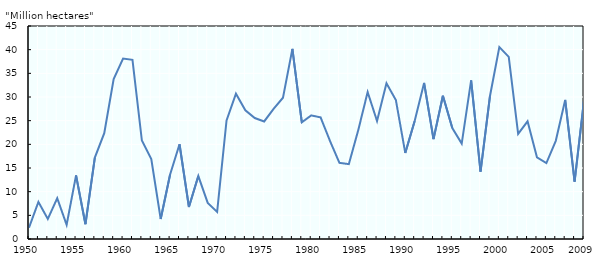
| Category | Million hectares |
|---|---|
| 1950.0 | 2.398 |
| nan | 7.829 |
| nan | 4.236 |
| nan | 8.616 |
| nan | 2.988 |
| 1955.0 | 13.433 |
| nan | 3.127 |
| nan | 17.205 |
| nan | 22.361 |
| nan | 33.807 |
| 1960.0 | 38.125 |
| nan | 37.847 |
| nan | 20.808 |
| nan | 16.865 |
| nan | 4.219 |
| 1965.0 | 13.631 |
| nan | 20.015 |
| nan | 6.764 |
| nan | 13.294 |
| nan | 7.624 |
| 1970.0 | 5.723 |
| nan | 25.049 |
| nan | 30.699 |
| nan | 27.202 |
| nan | 25.553 |
| 1975.0 | 24.832 |
| nan | 27.492 |
| nan | 29.852 |
| nan | 40.169 |
| nan | 24.646 |
| 1980.0 | 26.111 |
| nan | 25.693 |
| nan | 20.697 |
| nan | 16.089 |
| nan | 15.819 |
| 1985.0 | 22.989 |
| nan | 31.042 |
| nan | 24.92 |
| nan | 32.904 |
| nan | 29.358 |
| 1990.0 | 18.175 |
| nan | 24.914 |
| nan | 32.98 |
| nan | 21.098 |
| nan | 30.282 |
| 1995.0 | 23.455 |
| nan | 20.151 |
| nan | 33.514 |
| nan | 14.237 |
| nan | 30.153 |
| 2000.0 | 40.541 |
| nan | 38.48 |
| nan | 22.207 |
| nan | 24.852 |
| nan | 17.255 |
| 2005.0 | 16.028 |
| nan | 20.738 |
| nan | 29.386 |
| nan | 12.137 |
| 2009.0 | 29.259 |